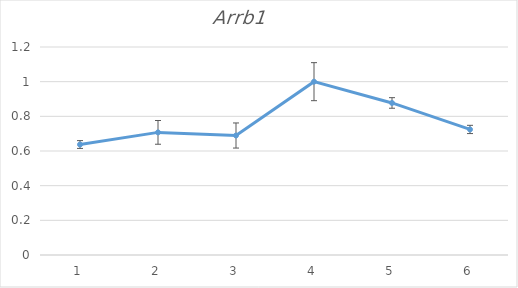
| Category | Series 0 |
|---|---|
| 0 | 0.637 |
| 1 | 0.707 |
| 2 | 0.689 |
| 3 | 1 |
| 4 | 0.877 |
| 5 | 0.724 |